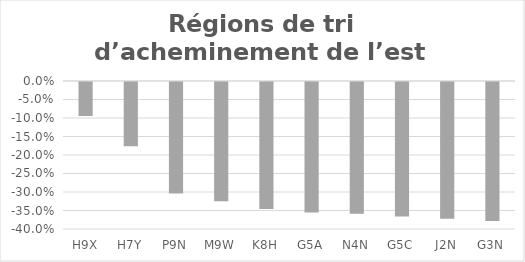
| Category | Series 0 |
|---|---|
| H9X | -0.092 |
| H7Y | -0.174 |
| P9N | -0.301 |
| M9W | -0.323 |
| K8H | -0.343 |
| G5A | -0.353 |
| N4N | -0.356 |
| G5C | -0.364 |
| J2N | -0.37 |
| G3N | -0.376 |